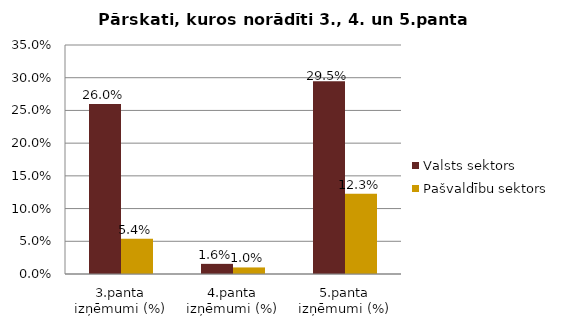
| Category | Valsts sektors | Pašvaldību sektors |
|---|---|---|
| 3.panta izņēmumi (%) | 0.26 | 0.054 |
| 4.panta izņēmumi (%) | 0.016 | 0.01 |
| 5.panta izņēmumi (%) | 0.295 | 0.123 |